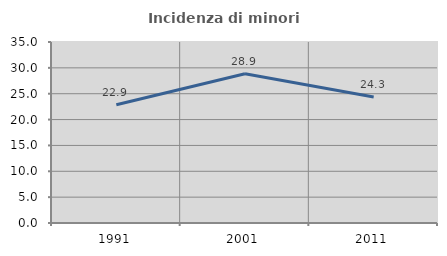
| Category | Incidenza di minori stranieri |
|---|---|
| 1991.0 | 22.857 |
| 2001.0 | 28.873 |
| 2011.0 | 24.349 |